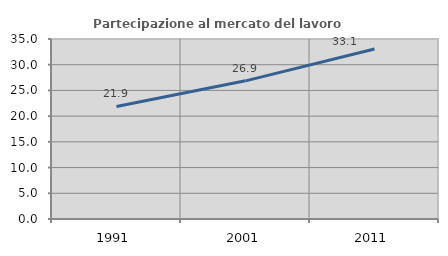
| Category | Partecipazione al mercato del lavoro  femminile |
|---|---|
| 1991.0 | 21.893 |
| 2001.0 | 26.866 |
| 2011.0 | 33.058 |